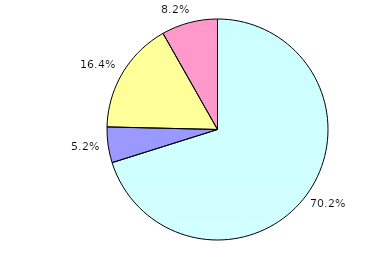
| Category | Series 0 |
|---|---|
| ledig | 94 |
| verheiratet | 7 |
| geschieden | 22 |
| sonstige | 11 |